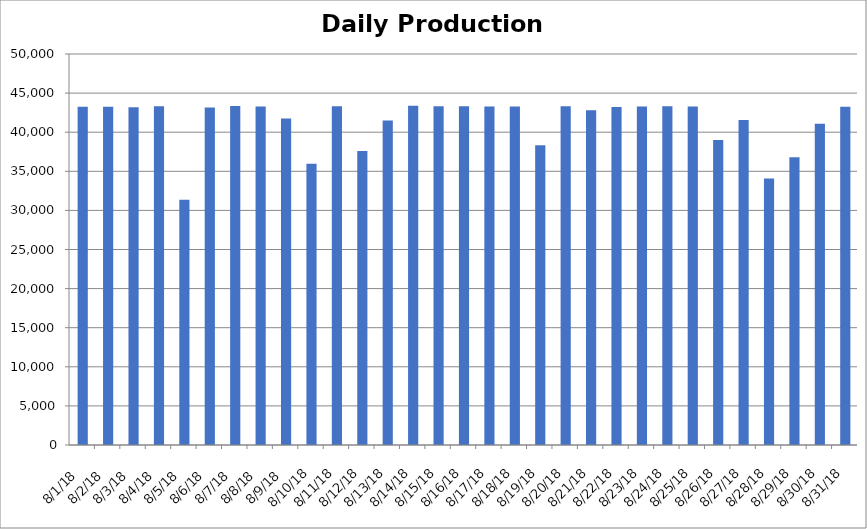
| Category | Series 0 |
|---|---|
| 8/1/18 | 43267 |
| 8/2/18 | 43257 |
| 8/3/18 | 43180 |
| 8/4/18 | 43305 |
| 8/5/18 | 31376 |
| 8/6/18 | 43153 |
| 8/7/18 | 43344 |
| 8/8/18 | 43285 |
| 8/9/18 | 41741 |
| 8/10/18 | 35978 |
| 8/11/18 | 43316 |
| 8/12/18 | 37597 |
| 8/13/18 | 41497 |
| 8/14/18 | 43379 |
| 8/15/18 | 43311 |
| 8/16/18 | 43309 |
| 8/17/18 | 43295 |
| 8/18/18 | 43280 |
| 8/19/18 | 38327 |
| 8/20/18 | 43312 |
| 8/21/18 | 42791 |
| 8/22/18 | 43218 |
| 8/23/18 | 43279 |
| 8/24/18 | 43318 |
| 8/25/18 | 43277 |
| 8/26/18 | 38992 |
| 8/27/18 | 41548 |
| 8/28/18 | 34079 |
| 8/29/18 | 36783 |
| 8/30/18 | 41093 |
| 8/31/18 | 43264 |